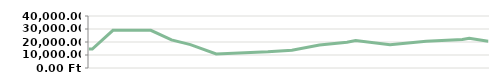
| Category | HÓNAP   |
|---|---|
| 2013-04-23 | 14600 |
| 2013-04-25 | 14600 |
| 2013-05-07 | 29000 |
| 2013-05-14 | 29000 |
| 2013-05-14 | 29000 |
| 2013-05-29 | 29000 |
| 2013-06-10 | 21600 |
| 2013-06-21 | 17950 |
| 2013-07-06 | 10776.471 |
| 2013-08-05 | 12455.862 |
| 2013-08-19 | 13667.568 |
| 2013-09-04 | 17651.667 |
| 2013-09-20 | 19877.912 |
| 2013-09-25 | 21138.05 |
| 2013-10-15 | 17951.744 |
| 2013-11-05 | 20556.13 |
| 2013-11-26 | 21997.139 |
| 2013-11-30 | 22917.635 |
| 2013-12-11 | 20504.315 |